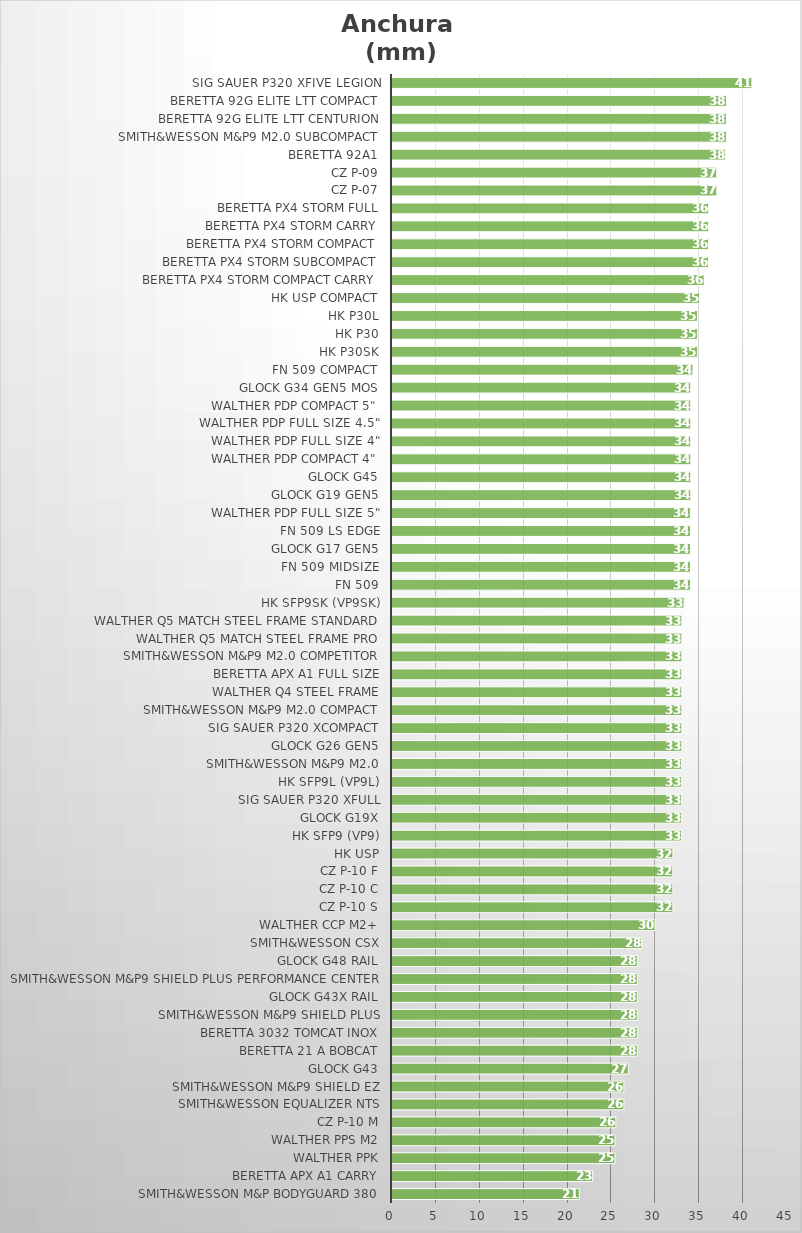
| Category | Anchura 
(mm) |
|---|---|
| Smith&Wesson M&P Bodyguard 380 | 21.336 |
| Beretta APX A1 Carry | 22.86 |
| Walther PPK | 25.4 |
| Walther PPS M2 | 25.4 |
| CZ P-10 M | 25.5 |
| Smith&Wesson Equalizer NTS | 26.416 |
| Smith&Wesson M&P9 Shield EZ | 26.416 |
| Glock G43 | 26.924 |
| Beretta 21 A Bobcat | 27.94 |
| Beretta 3032 Tomcat Inox | 27.94 |
| Smith&Wesson M&P9 Shield Plus | 27.94 |
| Glock G43X Rail | 27.94 |
| Smith&Wesson M&P9 Shield Plus Performance Center | 27.94 |
| Glock G48 Rail | 27.94 |
| Smith&Wesson CSX | 28.448 |
| Walther CCP M2+ | 29.972 |
| CZ P-10 S | 32 |
| CZ P-10 C | 32 |
| CZ P-10 F | 32 |
| HK USP | 32.004 |
| HK SFP9 (VP9) | 33 |
| Glock G19X | 33 |
| SIG Sauer P320 XFULL | 33 |
| HK SFP9L (VP9L) | 33 |
| Smith&Wesson M&P9 M2.0 | 33 |
| Glock G26 Gen5 | 33.02 |
| SIG Sauer P320 XCOMPACT | 33.02 |
| Smith&Wesson M&P9 M2.0 Compact | 33.02 |
| Walther Q4 Steel Frame | 33.02 |
| Beretta APX A1 Full Size | 33.02 |
| Smith&Wesson M&P9 M2.0 Competitor | 33.02 |
| Walther Q5 Match Steel Frame Pro | 33.02 |
| Walther Q5 Match Steel Frame Standard | 33.02 |
| HK SFP9SK (VP9SK) | 33.274 |
| FN 509 | 34 |
| FN 509 Midsize | 34 |
| Glock G17 Gen5 | 34 |
| FN 509 LS Edge | 34 |
| Walther PDP Full Size 5" | 34 |
| Glock G19 Gen5 | 34.036 |
| Glock G45 | 34.036 |
| Walther PDP Compact 4" | 34.036 |
| Walther PDP Full Size 4" | 34.036 |
| Walther PDP Full Size 4.5" | 34.036 |
| Walther PDP Compact 5" | 34.036 |
| Glock G34 Gen5 MOS | 34.036 |
| FN 509 Compact | 34.29 |
| HK P30SK | 34.798 |
| HK P30 | 34.798 |
| HK P30L | 34.798 |
| HK USP Compact | 35.052 |
| Beretta Px4 Storm Compact Carry | 35.56 |
| Beretta Px4 Storm SubCompact | 36.068 |
| Beretta Px4 Storm Compact | 36.068 |
| Beretta Px4 Storm Carry | 36.068 |
| Beretta Px4 Storm Full | 36.068 |
| CZ P-07 | 37 |
| CZ P-09 | 37 |
| Beretta 92A1 | 38 |
| Smith&Wesson M&P9 M2.0 Subcompact | 38.1 |
| Beretta 92G Elite LTT Centurion | 38.1 |
| Beretta 92G Elite LTT Compact | 38.1 |
| SIG Sauer P320 XFIVE Legion | 41 |